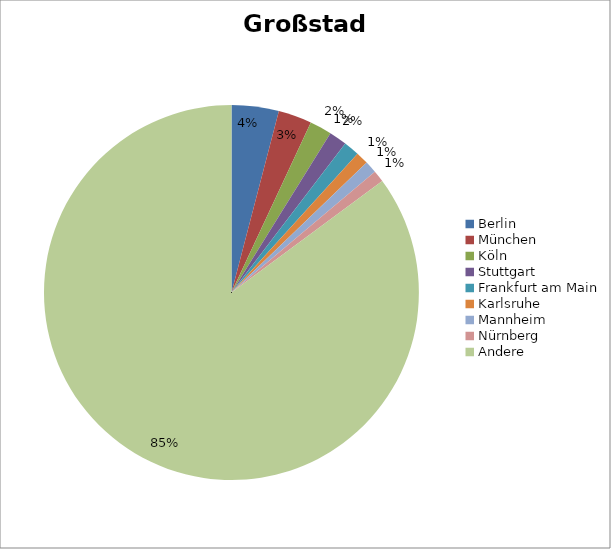
| Category | Series 0 |
|---|---|
| Berlin | 689 |
| München | 489 |
| Köln | 321 |
| Stuttgart | 259 |
| Frankfurt am Main | 229 |
| Karlsruhe | 184 |
| Mannheim | 176 |
| Nürnberg | 171 |
| Andere | 14424 |